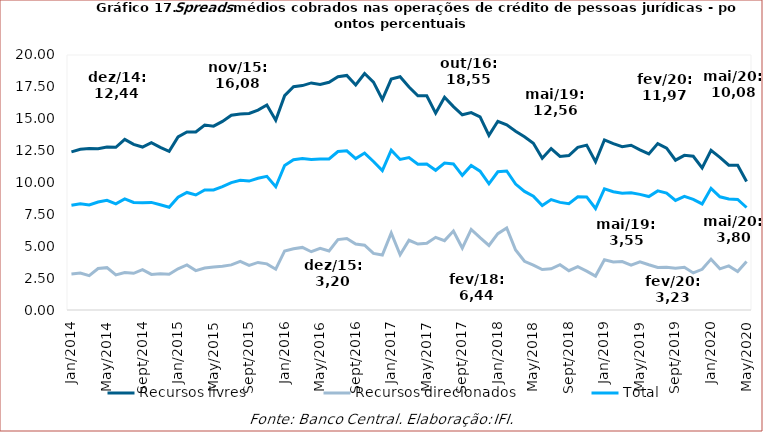
| Category | Recursos livres | Recursos direcionados | Total |
|---|---|---|---|
| 2014-01-01 | 12.4 | 2.83 | 8.21 |
| 2014-02-01 | 12.6 | 2.9 | 8.33 |
| 2014-03-01 | 12.66 | 2.69 | 8.24 |
| 2014-04-01 | 12.64 | 3.25 | 8.47 |
| 2014-05-01 | 12.79 | 3.32 | 8.6 |
| 2014-06-01 | 12.76 | 2.75 | 8.33 |
| 2014-07-01 | 13.38 | 2.94 | 8.72 |
| 2014-08-01 | 12.99 | 2.88 | 8.44 |
| 2014-09-01 | 12.78 | 3.16 | 8.42 |
| 2014-10-01 | 13.13 | 2.79 | 8.44 |
| 2014-11-01 | 12.75 | 2.84 | 8.25 |
| 2014-12-01 | 12.44 | 2.8 | 8.06 |
| 2015-01-01 | 13.58 | 3.23 | 8.84 |
| 2015-02-01 | 13.97 | 3.53 | 9.22 |
| 2015-03-01 | 13.97 | 3.09 | 9.02 |
| 2015-04-01 | 14.51 | 3.29 | 9.42 |
| 2015-05-01 | 14.42 | 3.38 | 9.42 |
| 2015-06-01 | 14.79 | 3.44 | 9.68 |
| 2015-07-01 | 15.28 | 3.54 | 9.99 |
| 2015-08-01 | 15.38 | 3.82 | 10.18 |
| 2015-09-01 | 15.42 | 3.5 | 10.11 |
| 2015-10-01 | 15.68 | 3.73 | 10.33 |
| 2015-11-01 | 16.08 | 3.62 | 10.48 |
| 2015-12-01 | 14.89 | 3.2 | 9.67 |
| 2016-01-01 | 16.81 | 4.63 | 11.34 |
| 2016-02-01 | 17.51 | 4.8 | 11.79 |
| 2016-03-01 | 17.6 | 4.91 | 11.89 |
| 2016-04-01 | 17.81 | 4.57 | 11.81 |
| 2016-05-01 | 17.69 | 4.83 | 11.85 |
| 2016-06-01 | 17.86 | 4.63 | 11.85 |
| 2016-07-01 | 18.29 | 5.52 | 12.43 |
| 2016-08-01 | 18.4 | 5.61 | 12.49 |
| 2016-09-01 | 17.65 | 5.17 | 11.88 |
| 2016-10-01 | 18.55 | 5.08 | 12.31 |
| 2016-11-01 | 17.87 | 4.44 | 11.65 |
| 2016-12-01 | 16.51 | 4.31 | 10.93 |
| 2017-01-01 | 18.11 | 6.04 | 12.54 |
| 2017-02-01 | 18.29 | 4.33 | 11.81 |
| 2017-03-01 | 17.49 | 5.47 | 11.96 |
| 2017-04-01 | 16.8 | 5.17 | 11.44 |
| 2017-05-01 | 16.8 | 5.23 | 11.45 |
| 2017-06-01 | 15.44 | 5.7 | 10.96 |
| 2017-07-01 | 16.69 | 5.44 | 11.52 |
| 2017-08-01 | 15.95 | 6.19 | 11.46 |
| 2017-09-01 | 15.31 | 4.86 | 10.56 |
| 2017-10-01 | 15.48 | 6.32 | 11.34 |
| 2017-11-01 | 15.14 | 5.67 | 10.89 |
| 2017-12-01 | 13.7 | 5.06 | 9.9 |
| 2018-01-01 | 14.8 | 5.99 | 10.84 |
| 2018-02-01 | 14.53 | 6.44 | 10.9 |
| 2018-03-01 | 14.02 | 4.71 | 9.88 |
| 2018-04-01 | 13.58 | 3.82 | 9.3 |
| 2018-05-01 | 13.08 | 3.52 | 8.93 |
| 2018-06-01 | 11.9 | 3.17 | 8.19 |
| 2018-07-01 | 12.66 | 3.23 | 8.66 |
| 2018-08-01 | 12.04 | 3.55 | 8.44 |
| 2018-09-01 | 12.11 | 3.08 | 8.34 |
| 2018-10-01 | 12.76 | 3.4 | 8.88 |
| 2018-11-01 | 12.93 | 3.05 | 8.87 |
| 2018-12-01 | 11.63 | 2.66 | 7.96 |
| 2019-01-01 | 13.34 | 3.94 | 9.5 |
| 2019-02-01 | 13.05 | 3.76 | 9.28 |
| 2019-03-01 | 12.81 | 3.8 | 9.15 |
| 2019-04-01 | 12.92 | 3.51 | 9.2 |
| 2019-05-01 | 12.56 | 3.78 | 9.07 |
| 2019-06-01 | 12.24 | 3.55 | 8.9 |
| 2019-07-01 | 13.05 | 3.34 | 9.34 |
| 2019-08-01 | 12.7 | 3.35 | 9.17 |
| 2019-09-01 | 11.75 | 3.27 | 8.59 |
| 2019-10-01 | 12.13 | 3.35 | 8.91 |
| 2019-11-01 | 12.06 | 2.91 | 8.68 |
| 2019-12-01 | 11.14 | 3.19 | 8.32 |
| 2020-01-01 | 12.53 | 3.99 | 9.54 |
| 2020-02-01 | 11.97 | 3.23 | 8.88 |
| 2020-03-01 | 11.36 | 3.46 | 8.71 |
| 2020-04-01 | 11.35 | 3.02 | 8.67 |
| 2020-05-01 | 10.08 | 3.8 | 8.04 |